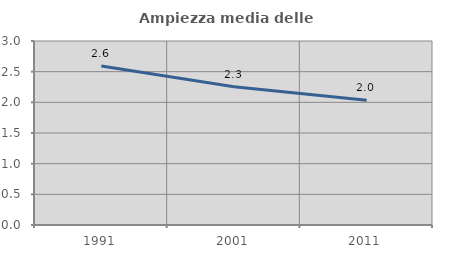
| Category | Ampiezza media delle famiglie |
|---|---|
| 1991.0 | 2.592 |
| 2001.0 | 2.254 |
| 2011.0 | 2.035 |